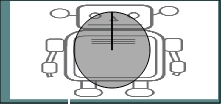
| Category | Series 0 |
|---|---|
| 0 | 0 |
| 1 | 50000 |